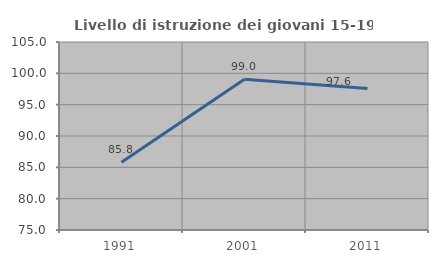
| Category | Livello di istruzione dei giovani 15-19 anni |
|---|---|
| 1991.0 | 85.827 |
| 2001.0 | 99.048 |
| 2011.0 | 97.59 |